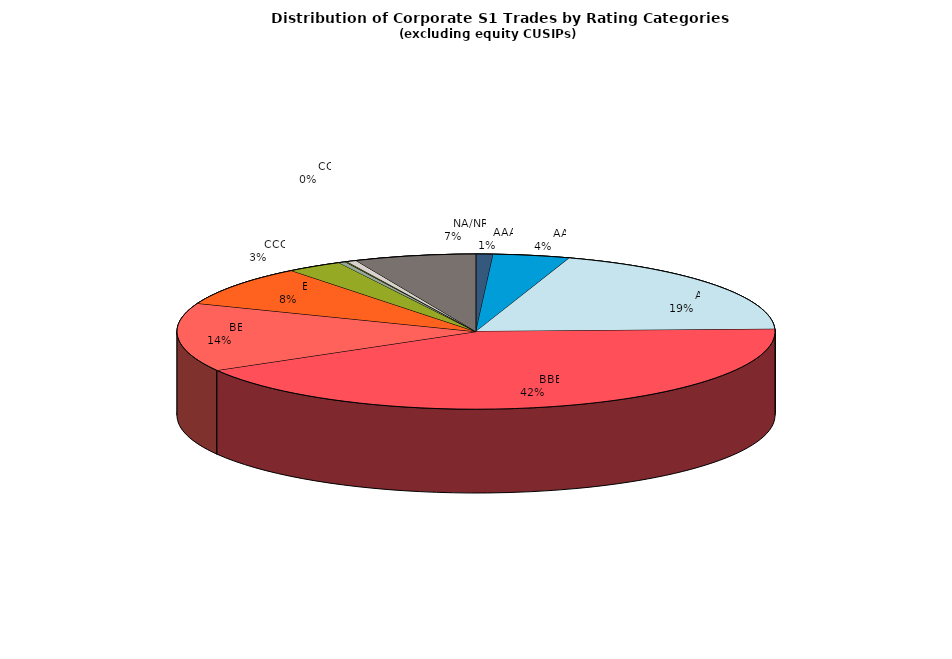
| Category | Series 0 |
|---|---|
|         AAA | 606.952 |
|         AA | 2728.369 |
|         A | 12821.869 |
|         BBB | 27788.183 |
|         BB | 9388.155 |
|         B | 5586.706 |
|         CCC | 1987.151 |
|         CC | 247.123 |
|         C | 65.46 |
|         D | 352.583 |
|         NA/NR | 4331.091 |